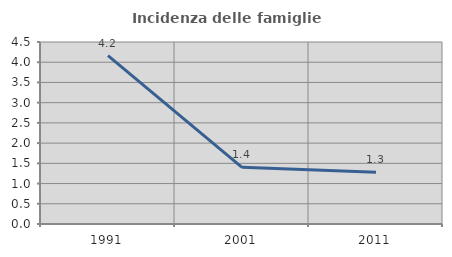
| Category | Incidenza delle famiglie numerose |
|---|---|
| 1991.0 | 4.162 |
| 2001.0 | 1.401 |
| 2011.0 | 1.277 |